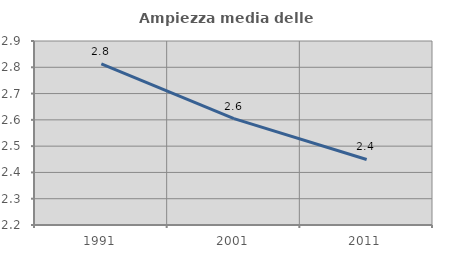
| Category | Ampiezza media delle famiglie |
|---|---|
| 1991.0 | 2.813 |
| 2001.0 | 2.604 |
| 2011.0 | 2.449 |